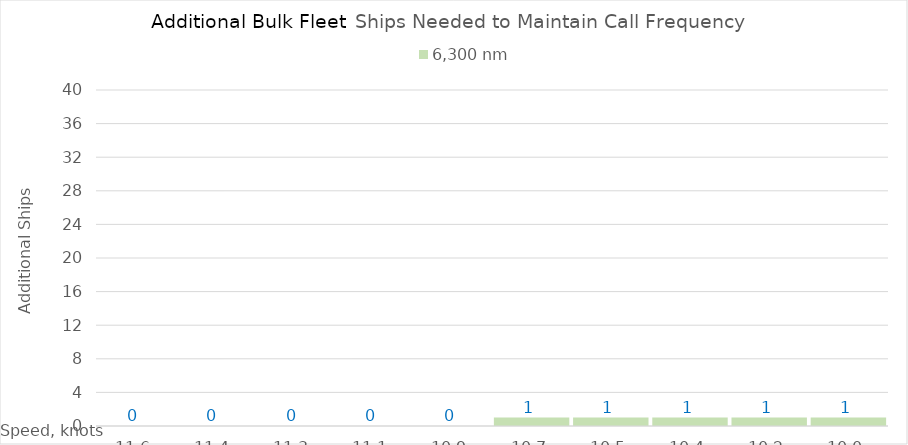
| Category | 6,300 |
|---|---|
| 11.620000000000001 | 0 |
| 11.440000000000001 | 0 |
| 11.260000000000002 | 0 |
| 11.080000000000002 | 0 |
| 10.900000000000002 | 0 |
| 10.720000000000002 | 1 |
| 10.540000000000003 | 1 |
| 10.360000000000003 | 1 |
| 10.180000000000003 | 1 |
| 10.000000000000004 | 1 |